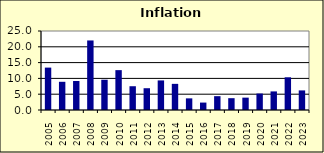
| Category | 9.9 |
|---|---|
| 2005.0 | 13.419 |
| 2006.0 | 8.924 |
| 2007.0 | 9.17 |
| 2008.0 | 22.007 |
| 2009.0 | 9.578 |
| 2010.0 | 12.616 |
| 2011.0 | 7.522 |
| 2012.0 | 6.892 |
| 2013.0 | 9.36 |
| 2014.0 | 8.275 |
| 2015.0 | 3.681 |
| 2016.0 | 2.35 |
| 2017.0 | 4.378 |
| 2018.0 | 3.74 |
| 2019.0 | 3.91 |
| 2020.0 | 5.21 |
| 2021.0 | 5.882 |
| 2022.0 | 10.347 |
| 2023.0 | 6.2 |